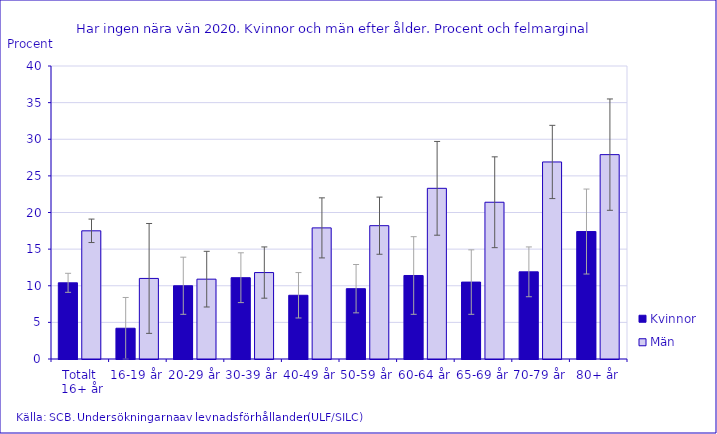
| Category | Kvinnor | Män |
|---|---|---|
| Totalt
 16+ år | 10.4 | 17.5 |
| 16-19 år | 4.2 | 11 |
| 20-29 år | 10 | 10.9 |
| 30-39 år | 11.1 | 11.8 |
| 40-49 år | 8.7 | 17.9 |
| 50-59 år | 9.6 | 18.2 |
| 60-64 år | 11.4 | 23.3 |
| 65-69 år | 10.5 | 21.4 |
| 70-79 år | 11.9 | 26.9 |
| 80+ år | 17.4 | 27.9 |